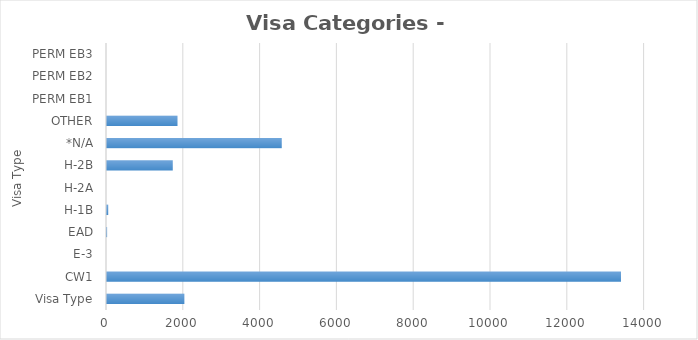
| Category | Series 0 |
|---|---|
| Visa Type | 2015 |
| CW1 | 13385 |
| E-3 | 0 |
| EAD | 3 |
| H-1B | 32 |
| H-2A | 0 |
| H-2B | 1713 |
| *N/A | 4551 |
| OTHER | 1836 |
| PERM EB1 | 0 |
| PERM EB2 | 0 |
| PERM EB3 | 0 |